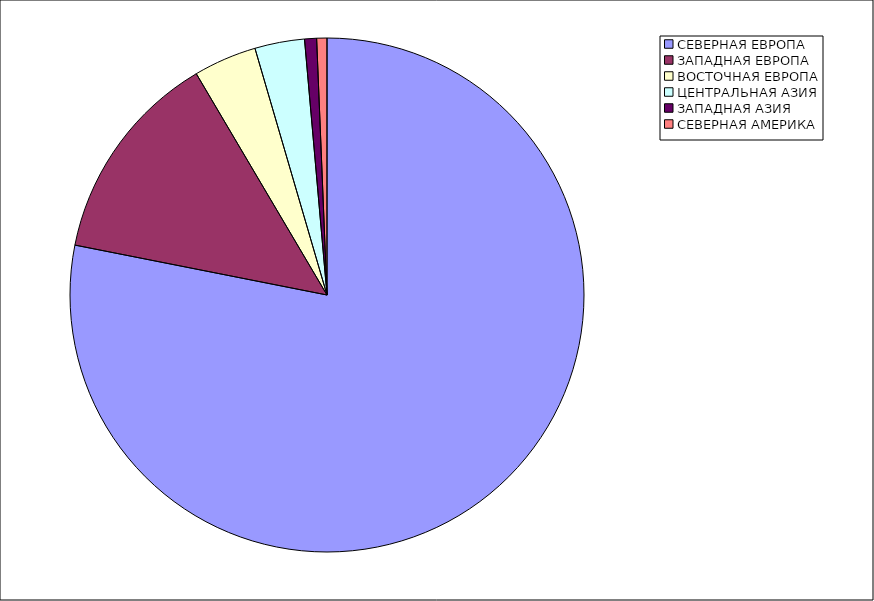
| Category | Оборот |
|---|---|
| СЕВЕРНАЯ ЕВРОПА | 77.72 |
| ЗАПАДНАЯ ЕВРОПА | 13.33 |
| ВОСТОЧНАЯ ЕВРОПА | 3.95 |
| ЦЕНТРАЛЬНАЯ АЗИЯ | 3.11 |
| ЗАПАДНАЯ АЗИЯ | 0.75 |
| СЕВЕРНАЯ АМЕРИКА | 0.64 |